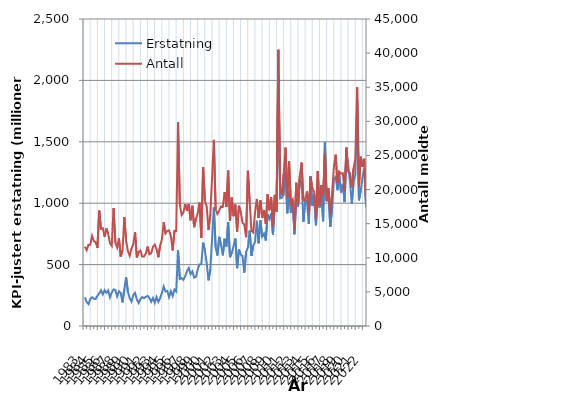
| Category | Erstatning |
|---|---|
| 1983.0 | 232.937 |
| nan | 195.121 |
| nan | 178.438 |
| nan | 218.579 |
| 1984.0 | 234.389 |
| nan | 221.715 |
| nan | 219.826 |
| nan | 245.877 |
| 1985.0 | 265.702 |
| nan | 290.42 |
| nan | 257.346 |
| nan | 291.865 |
| 1986.0 | 270.604 |
| nan | 289.558 |
| nan | 233.055 |
| nan | 272.728 |
| 1987.0 | 297.95 |
| nan | 294.021 |
| nan | 240.61 |
| nan | 283.085 |
| 1988.0 | 269.44 |
| nan | 192.069 |
| nan | 299.153 |
| nan | 396.293 |
| 1989.0 | 279.972 |
| nan | 226.285 |
| nan | 199.112 |
| nan | 251.201 |
| 1990.0 | 268.971 |
| nan | 216.388 |
| nan | 187.666 |
| nan | 218.436 |
| 1991.0 | 235.713 |
| nan | 226.637 |
| nan | 237.191 |
| nan | 245.226 |
| 1992.0 | 229.086 |
| nan | 197.393 |
| nan | 228.083 |
| nan | 188.213 |
| 1993.0 | 236.156 |
| nan | 196.535 |
| nan | 227.061 |
| nan | 268.62 |
| 1994.0 | 321.731 |
| nan | 281.266 |
| nan | 285.763 |
| nan | 235.54 |
| 1995.0 | 283.776 |
| nan | 244.132 |
| nan | 296.645 |
| nan | 281.65 |
| 1996.0 | 617.657 |
| nan | 382.464 |
| nan | 389.296 |
| nan | 375.446 |
| 1997.0 | 406.453 |
| nan | 446.013 |
| nan | 472.333 |
| nan | 421.43 |
| 1998.0 | 444.599 |
| nan | 393.872 |
| nan | 400.307 |
| nan | 460.108 |
| 1999.0 | 501.845 |
| nan | 504.283 |
| nan | 678.577 |
| nan | 614.541 |
| 2000.0 | 512.261 |
| nan | 372.014 |
| nan | 461.192 |
| nan | 703.176 |
| 2001.0 | 965.028 |
| nan | 638.852 |
| nan | 573.774 |
| nan | 725.942 |
| 2002.0 | 661.156 |
| nan | 575.27 |
| nan | 710.935 |
| nan | 647.82 |
| 2003.0 | 847.26 |
| nan | 560.178 |
| nan | 595.958 |
| nan | 649.208 |
| 2004.0 | 712.217 |
| nan | 470.87 |
| nan | 622.509 |
| nan | 581.854 |
| 2005.0 | 569.493 |
| nan | 434.602 |
| nan | 603.345 |
| nan | 639.394 |
| 2006.0 | 777.195 |
| nan | 569.965 |
| nan | 655.815 |
| nan | 684.196 |
| 2007.0 | 856.408 |
| nan | 673.317 |
| nan | 860.276 |
| nan | 727.347 |
| 2008.0 | 752.172 |
| nan | 696.322 |
| nan | 909.437 |
| nan | 873.42 |
| 2009.0 | 916.557 |
| nan | 744.098 |
| nan | 982.934 |
| nan | 929.078 |
| 2010.0 | 2038.021 |
| nan | 1039.492 |
| nan | 1044.493 |
| nan | 1068.56 |
| 2011.0 | 1262.842 |
| nan | 918.31 |
| nan | 1094.943 |
| nan | 922.779 |
| 2012.0 | 1022.313 |
| nan | 747.404 |
| nan | 1030.461 |
| nan | 970.277 |
| 2013.0 | 1191.601 |
| nan | 1166.802 |
| nan | 849.019 |
| nan | 1025.516 |
| 2014.0 | 1011.435 |
| nan | 830.588 |
| nan | 1221.838 |
| nan | 976.933 |
| 2015.0 | 1071.822 |
| nan | 820.828 |
| nan | 1086.542 |
| nan | 964.725 |
| 2016.0 | 1109.027 |
| nan | 853.659 |
| nan | 1497.167 |
| nan | 1015.828 |
| 2017.0 | 1088.954 |
| nan | 807.65 |
| nan | 953.843 |
| nan | 1191.034 |
| 2018.0 | 1215.874 |
| nan | 1106.121 |
| nan | 1232.942 |
| nan | 1087.816 |
| 2019.0 | 1157.146 |
| nan | 1008.947 |
| nan | 1404.229 |
| nan | 1307.73 |
| 2020.0 | 1182.332 |
| nan | 993.156 |
| nan | 1171.889 |
| nan | 1232.253 |
| 2021.0 | 1816.342 |
| nan | 1023.29 |
| nan | 1100.926 |
| nan | 1213.6 |
| 2022.0 | 1280.476 |
| nan | 966.126 |